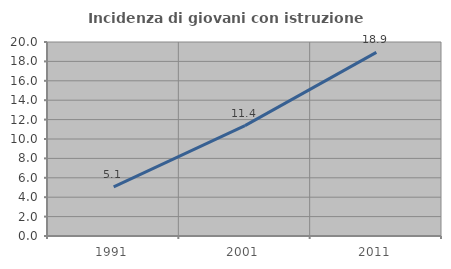
| Category | Incidenza di giovani con istruzione universitaria |
|---|---|
| 1991.0 | 5.065 |
| 2001.0 | 11.384 |
| 2011.0 | 18.934 |